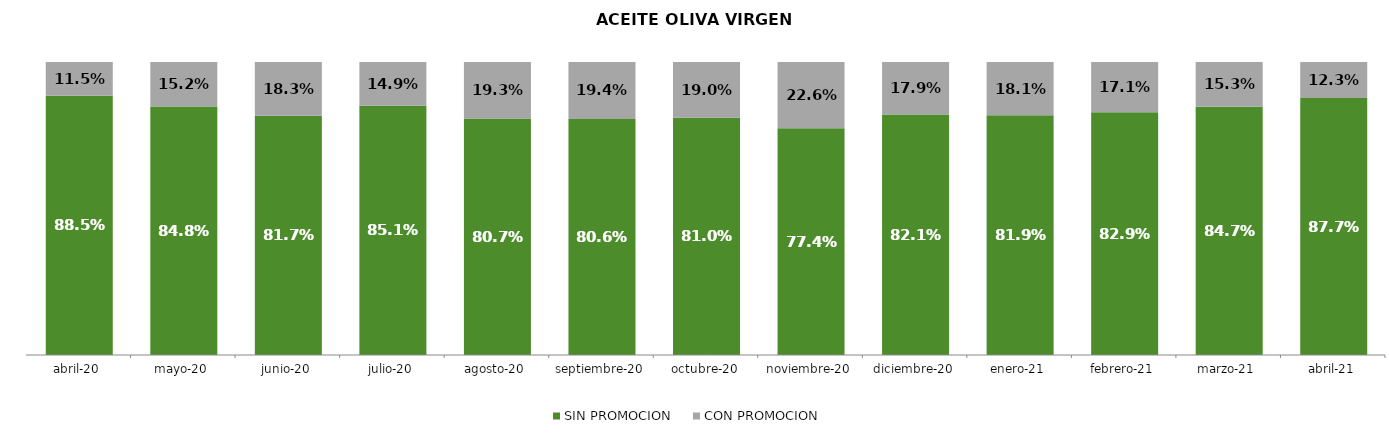
| Category | SIN PROMOCION   | CON PROMOCION   |
|---|---|---|
| 2020-04-01 | 0.885 | 0.115 |
| 2020-05-01 | 0.848 | 0.152 |
| 2020-06-01 | 0.817 | 0.183 |
| 2020-07-01 | 0.851 | 0.149 |
| 2020-08-01 | 0.807 | 0.193 |
| 2020-09-01 | 0.806 | 0.194 |
| 2020-10-01 | 0.81 | 0.19 |
| 2020-11-01 | 0.774 | 0.226 |
| 2020-12-01 | 0.821 | 0.179 |
| 2021-01-01 | 0.819 | 0.181 |
| 2021-02-01 | 0.829 | 0.171 |
| 2021-03-01 | 0.847 | 0.153 |
| 2021-04-01 | 0.877 | 0.123 |